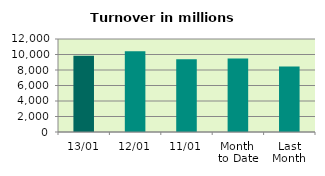
| Category | Series 0 |
|---|---|
| 13/01 | 9824.542 |
| 12/01 | 10409.082 |
| 11/01 | 9382.976 |
| Month 
to Date | 9470.681 |
| Last
Month | 8461.957 |